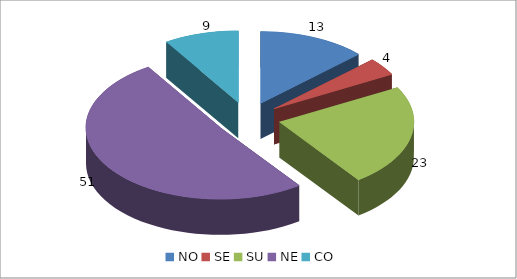
| Category | Series 0 |
|---|---|
| NO | 13 |
| SE | 4 |
| SU | 23 |
| NE | 51 |
| CO | 9 |